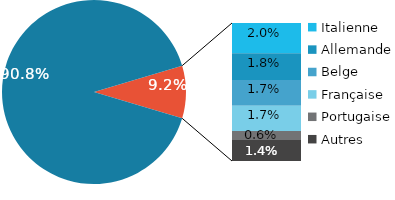
| Category | Series 0 |
|---|---|
| Luxembourgeoise | 0.907 |
| Italienne | 0.02 |
| Allemande | 0.018 |
| Belge | 0.017 |
| Française | 0.017 |
| Portugaise | 0.006 |
| Autres | 0.014 |